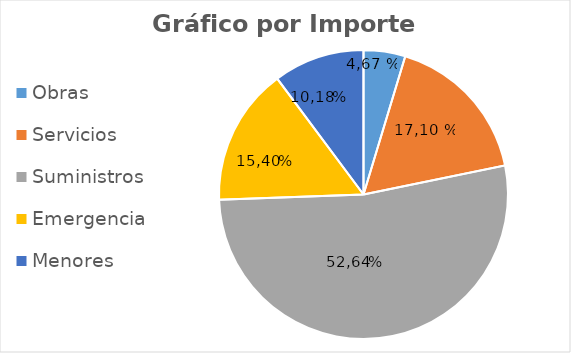
| Category | Series 0 |
|---|---|
| Obras | 3082713.57 |
| Servicios | 11294427 |
| Suministros | 34763292.61 |
| Emergencia | 10171988.77 |
| Menores | 6725312.17 |